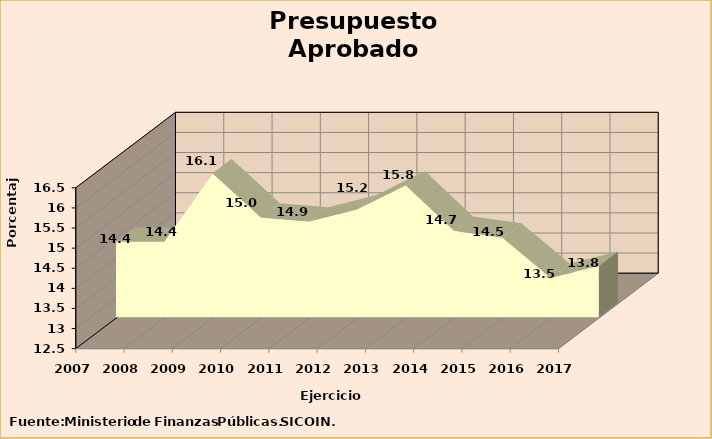
| Category | Series 0 |
|---|---|
| 2007 | 14.4 |
| 2008 | 14.4 |
| 2009 | 16.1 |
| 2010 | 15 |
| 2011 | 14.9 |
| 2012 | 15.2 |
| 2013 | 15.8 |
| 2014 | 14.67 |
| 2015 | 14.5 |
| 2016 | 13.5 |
| 2017 | 13.8 |